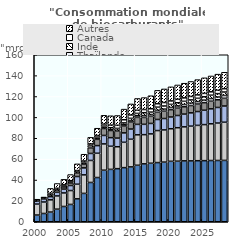
| Category | États-Unis | Brésil | Chine | Union européenne | Thaïlande | Inde | Canada | Autres |
|---|---|---|---|---|---|---|---|---|
| 2000.0 | 6.43 | 10.49 | 2.97 | 0.7 | 0 | 0 | 0.26 | 0.75 |
| 2001.0 | 7.93 | 10.98 | 3 | 0.73 | 0 | 0 | 0.26 | 0.77 |
| 2002.0 | 9.27 | 11.73 | 3.03 | 1.39 | 0.07 | 1.45 | 0.27 | 4.71 |
| 2003.0 | 12.06 | 12.68 | 3.47 | 2.01 | 0.13 | 1.35 | 0.36 | 4.57 |
| 2004.0 | 14.64 | 12.96 | 3.66 | 2.29 | 0.15 | 1.47 | 0.36 | 5.09 |
| 2005.0 | 16.6 | 13.31 | 4.82 | 2.49 | 0.31 | 1.41 | 0.36 | 5.89 |
| 2006.0 | 21.96 | 14 | 7.37 | 3.55 | 0.39 | 1.5 | 0.31 | 6.37 |
| 2007.0 | 27.17 | 17.75 | 6.68 | 3.51 | 0.33 | 1.68 | 1.09 | 6.48 |
| 2008.0 | 37.64 | 21.1 | 6.7 | 5.43 | 0.48 | 1.75 | 1.46 | 6.3 |
| 2009.0 | 42.37 | 23.25 | 7.33 | 5.99 | 0.64 | 1.45 | 1.6 | 6.99 |
| 2010.0 | 49.4 | 25.18 | 8.1 | 6.65 | 0.65 | 1.66 | 1.87 | 8.48 |
| 2011.0 | 50.18 | 22.15 | 8.25 | 6.86 | 0.68 | 1.94 | 2.53 | 8.95 |
| 2012.0 | 50.86 | 21.01 | 8.25 | 6.79 | 0.7 | 1.85 | 2.94 | 9.39 |
| 2013.0 | 51.85 | 24.28 | 8.99 | 6.61 | 1.13 | 1.84 | 3.04 | 10.17 |
| 2014.0 | 52.55 | 26.51 | 9.75 | 6.74 | 1.39 | 2.14 | 3.16 | 10.64 |
| 2015.0 | 54.13 | 29.15 | 10 | 6.73 | 1.52 | 2.26 | 3.02 | 11.28 |
| 2016.0 | 55.47 | 27.98 | 9.9 | 6.6 | 1.78 | 2.74 | 3.05 | 11.46 |
| 2017.0 | 56.06 | 28.13 | 10 | 6.82 | 1.72 | 2.32 | 3.22 | 12.46 |
| 2018.0 | 56.7 | 30.68 | 10.6 | 6.9 | 1.92 | 2.97 | 3.32 | 12.77 |
| 2019.0 | 57.14 | 30.84 | 10.92 | 7.05 | 1.98 | 2.98 | 3.32 | 13.02 |
| 2020.0 | 57.91 | 31.2 | 11.25 | 7.04 | 2.05 | 3.01 | 3.34 | 13.46 |
| 2021.0 | 58.02 | 32.07 | 11.72 | 7.04 | 2.12 | 3.04 | 3.34 | 13.7 |
| 2022.0 | 58.33 | 32.59 | 12.21 | 6.99 | 2.19 | 3.07 | 3.33 | 14.02 |
| 2023.0 | 58.32 | 33.29 | 12.71 | 7.04 | 2.27 | 3.11 | 3.31 | 14.33 |
| 2024.0 | 58.5 | 33.85 | 13.24 | 7.19 | 2.35 | 3.14 | 3.3 | 14.62 |
| 2025.0 | 58.54 | 34.53 | 13.78 | 7.26 | 2.43 | 3.18 | 3.28 | 14.9 |
| 2026.0 | 58.66 | 35.18 | 14.34 | 7.33 | 2.52 | 3.22 | 3.26 | 15.15 |
| 2027.0 | 58.7 | 35.88 | 14.92 | 7.38 | 2.6 | 3.25 | 3.25 | 15.43 |
| 2028.0 | 58.78 | 36.56 | 15.53 | 7.41 | 2.7 | 3.29 | 3.23 | 15.69 |